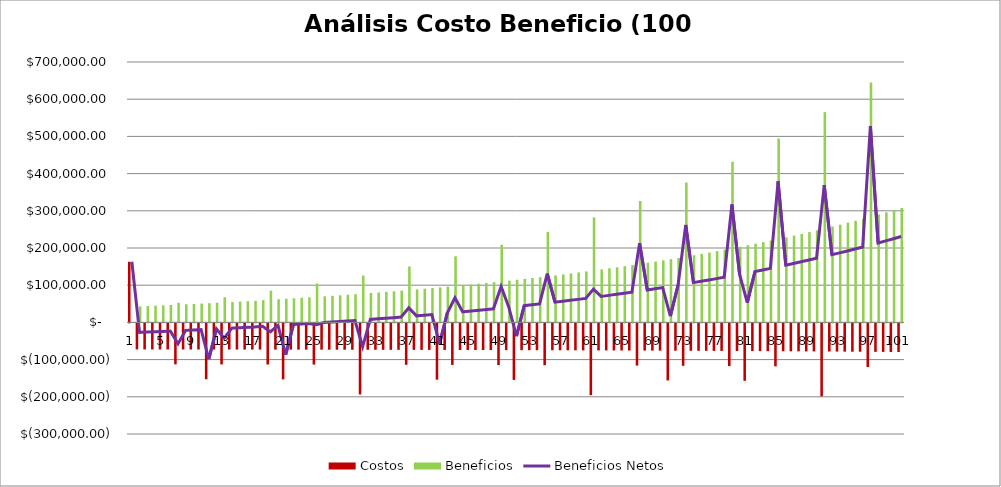
| Category |  Costos  |  Beneficios  |
|---|---|---|
| 0 | 163011.576 | 0 |
| 1 | -69961.532 | 43243.2 |
| 2 | -69984.443 | 44108.064 |
| 3 | -70007.811 | 44990.225 |
| 4 | -70031.647 | 45890.03 |
| 5 | -70055.959 | 46807.83 |
| 6 | -110092.851 | 52581.209 |
| 7 | -70106.053 | 48698.867 |
| 8 | -70131.853 | 49672.844 |
| 9 | -70158.17 | 50666.301 |
| 10 | -150185.013 | 51679.627 |
| 11 | -70212.392 | 52713.22 |
| 12 | -110275.017 | 67646.466 |
| 13 | -70268.806 | 54842.834 |
| 14 | -70297.861 | 55939.69 |
| 15 | -70327.498 | 57058.484 |
| 16 | -70357.727 | 58199.654 |
| 17 | -70403.978 | 59945.643 |
| 18 | -110495.605 | 85203.384 |
| 19 | -70467.509 | 62343.935 |
| 20 | -150500.23 | 63579.173 |
| 21 | -70533.606 | 64839.117 |
| 22 | -70567.649 | 66124.259 |
| 23 | -70602.374 | 67435.105 |
| 24 | -110726.861 | 104399.718 |
| 25 | -70673.919 | 70135.97 |
| 26 | -70710.769 | 71527.05 |
| 27 | -70748.355 | 72945.951 |
| 28 | -70786.694 | 74393.23 |
| 29 | -70825.799 | 75869.454 |
| 30 | -190987.309 | 126024.55 |
| 31 | -70906.371 | 78911.068 |
| 32 | -70947.869 | 80477.649 |
| 33 | -70990.198 | 82075.562 |
| 34 | -71033.373 | 83705.434 |
| 35 | -71077.412 | 85367.902 |
| 36 | -111280.582 | 150364.005 |
| 37 | -71168.149 | 88793.253 |
| 38 | -71214.883 | 90557.478 |
| 39 | -71262.552 | 92356.988 |
| 40 | -151311.174 | 94192.487 |
| 41 | -71360.769 | 96064.697 |
| 42 | -111610.821 | 177760.568 |
| 43 | -71462.953 | 99922.198 |
| 44 | -71515.584 | 101909.002 |
| 45 | -71569.266 | 103935.543 |
| 46 | -71624.023 | 106002.614 |
| 47 | -71679.875 | 108111.026 |
| 48 | -111982.689 | 208599.93 |
| 49 | -71794.951 | 112455.199 |
| 50 | -151854.221 | 114692.663 |
| 51 | -71914.677 | 116974.876 |
| 52 | -71976.342 | 119302.734 |
| 53 | -72039.24 | 121677.148 |
| 54 | -112401.439 | 243316.443 |
| 55 | -72168.835 | 126569.392 |
| 56 | -72235.583 | 129089.14 |
| 57 | -72303.666 | 131659.283 |
| 58 | -72373.11 | 134280.829 |
| 59 | -72443.943 | 136954.806 |
| 60 | -192872.986 | 282399.258 |
| 61 | -72589.888 | 142464.267 |
| 62 | -72665.057 | 145301.913 |
| 63 | -72741.73 | 148196.311 |
| 64 | -72819.936 | 151148.597 |
| 65 | -72899.705 | 154159.929 |
| 66 | -113403.99 | 326399.239 |
| 67 | -73064.063 | 160364.478 |
| 68 | -73148.716 | 163560.127 |
| 69 | -73235.061 | 166819.69 |
| 70 | -153323.134 | 170144.444 |
| 71 | -73412.967 | 173535.693 |
| 72 | -114001.953 | 375936.746 |
| 73 | -73598.061 | 180523.022 |
| 74 | -73693.393 | 184121.843 |
| 75 | -73790.632 | 187792.639 |
| 76 | -73889.816 | 191536.852 |
| 77 | -73990.984 | 195355.949 |
| 78 | -114675.322 | 431710.409 |
| 79 | -74199.429 | 203224.817 |
| 80 | -154306.789 | 207277.674 |
| 81 | -74416.296 | 211411.587 |
| 82 | -74527.993 | 215628.179 |
| 83 | -74641.924 | 219929.103 |
| 84 | -115433.611 | 494506.994 |
| 85 | -74876.668 | 228790.726 |
| 86 | -74997.572 | 233354.9 |
| 87 | -75120.895 | 238010.358 |
| 88 | -75246.684 | 242758.925 |
| 89 | -75374.989 | 247602.464 |
| 90 | -196287.534 | 565212.531 |
| 91 | -75639.348 | 257582.091 |
| 92 | -75775.506 | 262722.093 |
| 93 | -75914.387 | 267964.895 |
| 94 | -76056.046 | 273312.553 |
| 95 | -76200.538 | 278767.164 |
| 96 | -117249.155 | 644824.832 |
| 97 | -76498.25 | 290005.845 |
| 98 | -76651.586 | 295794.322 |
| 99 | -76807.989 | 301698.568 |
| 100 | -76967.52 | 307720.899 |